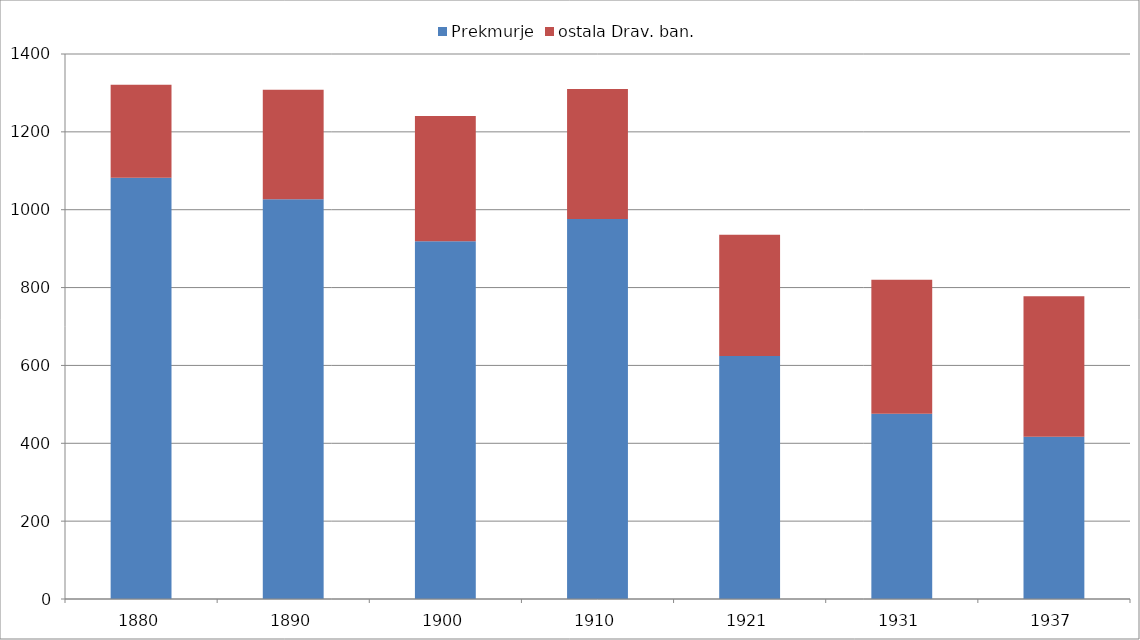
| Category | Prekmurje | ostala Drav. ban. |
|---|---|---|
| 1880.0 | 1082 | 239 |
| 1890.0 | 1027 | 281 |
| 1900.0 | 919 | 322 |
| 1910.0 | 976 | 334 |
| 1921.0 | 624 | 312 |
| 1931.0 | 476 | 344 |
| 1937.0 | 417 | 361 |